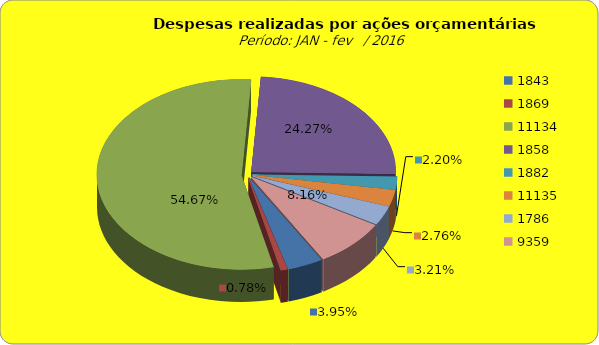
| Category | Series 1 |
|---|---|
| 1843.0 | 1915197.85 |
| 1869.0 | 377937.41 |
| 11134.0 | 26511825.03 |
| 1858.0 | 11769675.05 |
| 1882.0 | 1067411.5 |
| 11135.0 | 1340660.35 |
| 1786.0 | 1555347.28 |
| 9359.0 | 3958856.27 |